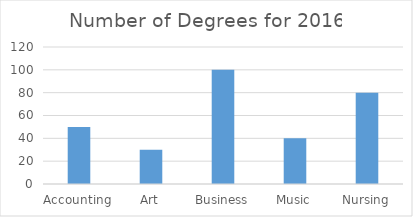
| Category | Number of Degrees for 2016 |
|---|---|
| Accounting | 50 |
| Art | 30 |
| Business | 100 |
| Music | 40 |
| Nursing | 80 |